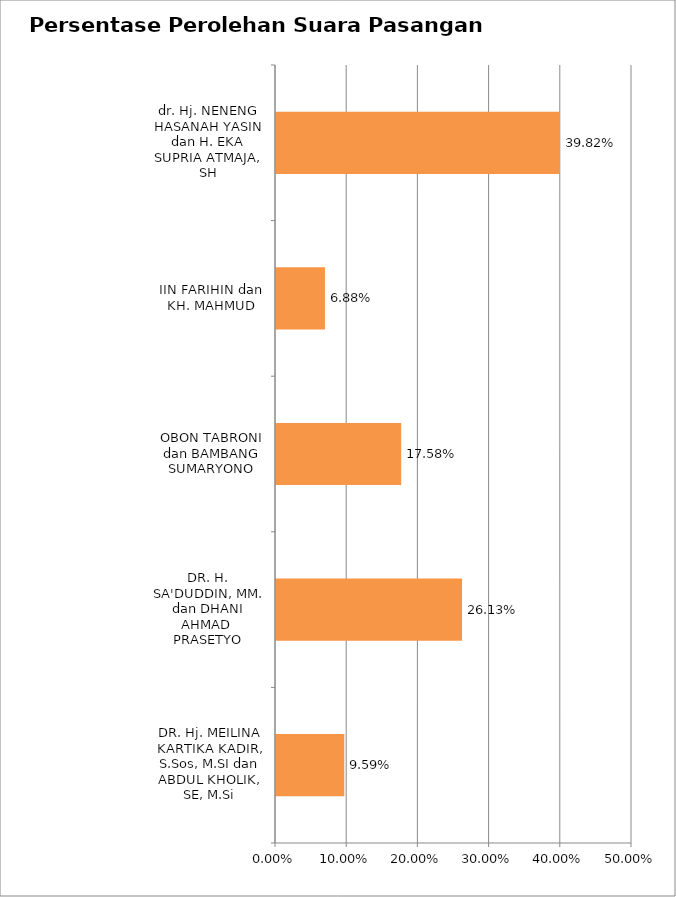
| Category | PERSENTASE |
|---|---|
| DR. Hj. MEILINA KARTIKA KADIR, S.Sos, M.SI dan ABDUL KHOLIK, SE, M.Si | 0.096 |
| DR. H. SA'DUDDIN, MM. dan DHANI AHMAD  PRASETYO | 0.261 |
| OBON TABRONI dan BAMBANG SUMARYONO | 0.176 |
| IIN FARIHIN dan KH. MAHMUD | 0.069 |
| dr. Hj. NENENG HASANAH YASIN dan H. EKA SUPRIA ATMAJA, SH | 0.398 |